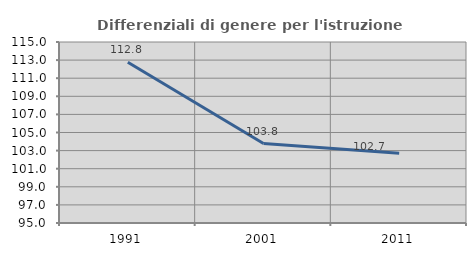
| Category | Differenziali di genere per l'istruzione superiore |
|---|---|
| 1991.0 | 112.755 |
| 2001.0 | 103.782 |
| 2011.0 | 102.699 |